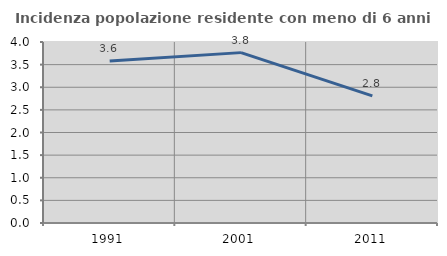
| Category | Incidenza popolazione residente con meno di 6 anni |
|---|---|
| 1991.0 | 3.58 |
| 2001.0 | 3.765 |
| 2011.0 | 2.811 |